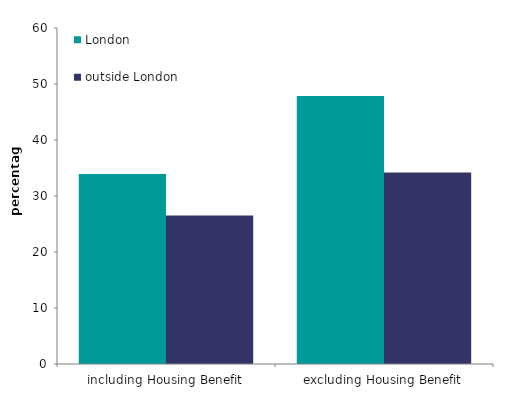
| Category | London | outside London |
|---|---|---|
| including Housing Benefit | 33.924 | 26.502 |
| excluding Housing Benefit | 47.845 | 34.205 |